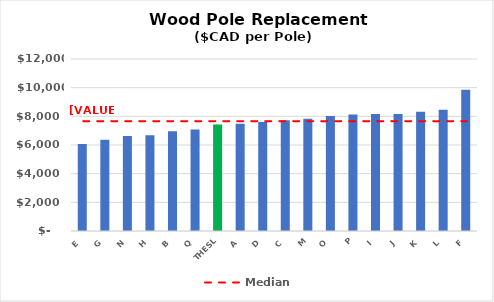
| Category | Series 0 |
|---|---|
| E | 6065.926 |
| G | 6358.211 |
| N | 6636.084 |
| H | 6683.953 |
| B | 6954.949 |
| Q | 7080.635 |
| THESL | 7434 |
| A | 7481.43 |
| D | 7605.206 |
| C | 7724.474 |
| M | 7834.902 |
| O | 8026.798 |
| P | 8124.369 |
| I | 8156.186 |
| J | 8165.971 |
| K | 8322.054 |
| L | 8456.672 |
| F | 9861.727 |